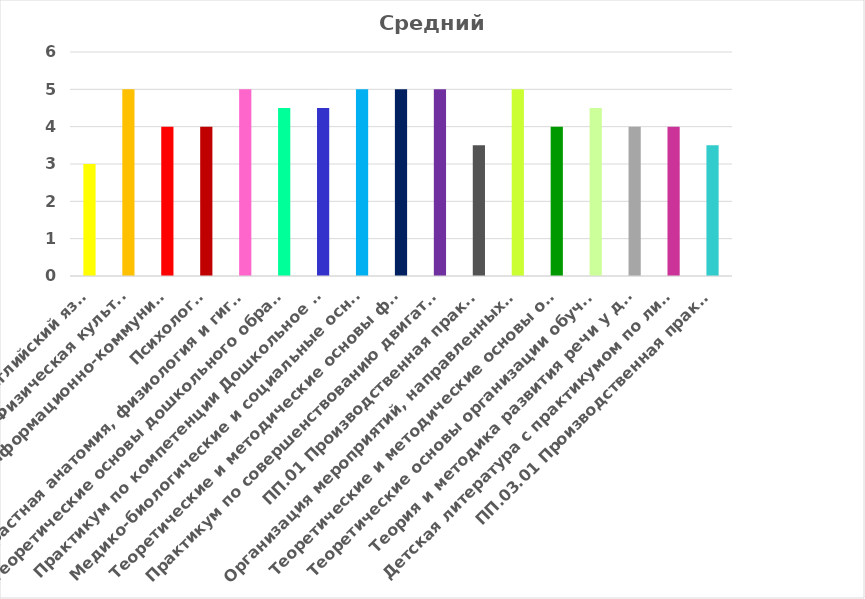
| Category | Средний балл |
|---|---|
| Английский язык | 3 |
| Физическая культура | 5 |
| Информатика и информационно-коммуникационные технологии в проф. деятельности | 4 |
| Психология | 4 |
| Возрастная анатомия, физиология и гигиена | 5 |
| Теоретические основы дошкольного образования | 4.5 |
| Практикум по компетенции Дошкольное воспитание (WSR) | 4.5 |
| Медико-биологические и социальные основы здоровья | 5 |
| Теоретические и методические основы физического воспитания и развития детей раннего и дошкольного возраста | 5 |
| Практикум по совершенствованию двигательных умений и навыков | 5 |
| ПП.01 Производственная практика | 3.5 |
| Организация мероприятий, направленных на укрепление здоровья ребенка и его физического развития | 5 |
| Теоретические и методические основы организации продуктивных видов деятельности детей дошкольного возраста | 4 |
| Теоретические основы организации обучения в разных возрастных группах | 4.5 |
| Теория и методика развития речи у детей | 4 |
| Детская литература с практикумом по литературному чтению | 4 |
| ПП.03.01 Производственная практика | 3.5 |